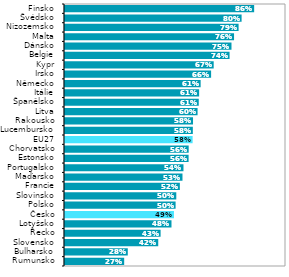
| Category | Series 1 |
|---|---|
| Rumunsko | 0.268 |
| Bulharsko | 0.284 |
| Slovensko | 0.422 |
| Řecko | 0.433 |
| Lotyšsko | 0.482 |
| Česko | 0.493 |
| Polsko | 0.5 |
| Slovinsko | 0.504 |
| Francie | 0.52 |
| Maďarsko | 0.532 |
| Portugalsko | 0.536 |
| Estonsko | 0.559 |
| Chorvatsko | 0.56 |
| EU27 | 0.577 |
| Lucembursko | 0.578 |
| Rakousko | 0.579 |
| Litva | 0.6 |
| Španělsko | 0.605 |
| Itálie | 0.607 |
| Německo | 0.614 |
| Irsko | 0.661 |
| Kypr | 0.673 |
| Belgie | 0.745 |
| Dánsko | 0.753 |
| Malta | 0.765 |
| Nizozemsko | 0.786 |
| Švédsko | 0.799 |
| Finsko | 0.856 |